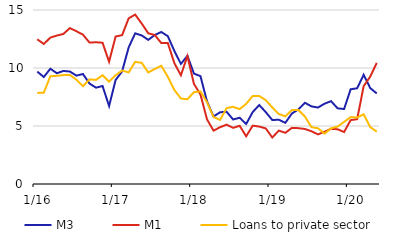
| Category | M3 | M1 | Loans to private sector |
|---|---|---|---|
|  1/16 | 9.691 | 12.477 | 7.853 |
| 2 | 9.221 | 12.071 | 7.865 |
| 3 | 9.937 | 12.619 | 9.286 |
| 4 | 9.548 | 12.796 | 9.325 |
| 5 | 9.747 | 12.937 | 9.385 |
| 6 | 9.696 | 13.442 | 9.403 |
| 7 | 9.341 | 13.169 | 8.992 |
| 8 | 9.484 | 12.872 | 8.426 |
| 9 | 8.659 | 12.193 | 9.022 |
| 10 | 8.307 | 12.218 | 8.975 |
| 11 | 8.449 | 12.177 | 9.38 |
| 12 | 6.723 | 10.54 | 8.816 |
|  1/17 | 8.966 | 12.711 | 9.379 |
| 2 | 9.714 | 12.834 | 9.781 |
| 3 | 11.775 | 14.282 | 9.62 |
| 4 | 12.987 | 14.606 | 10.528 |
| 5 | 12.808 | 13.83 | 10.445 |
| 6 | 12.425 | 12.993 | 9.619 |
| 7 | 12.849 | 12.842 | 9.914 |
| 8 | 13.105 | 12.147 | 10.193 |
| 9 | 12.743 | 12.148 | 9.238 |
| 10 | 11.473 | 10.419 | 8.113 |
| 11 | 10.355 | 9.377 | 7.368 |
| 12 | 11.047 | 11.032 | 7.305 |
|  1/18 | 9.516 | 8.626 | 7.918 |
| 2 | 9.298 | 7.714 | 7.983 |
| 3 | 7.121 | 5.573 | 7.051 |
| 4 | 5.819 | 4.602 | 5.78 |
| 5 | 6.185 | 4.894 | 5.522 |
| 6 | 6.228 | 5.118 | 6.536 |
| 7 | 5.561 | 4.84 | 6.657 |
| 8 | 5.712 | 5.02 | 6.454 |
| 9 | 5.172 | 4.113 | 6.908 |
| 10 | 6.2 | 5.031 | 7.59 |
| 11 | 6.807 | 4.95 | 7.588 |
| 12 | 6.195 | 4.794 | 7.229 |
|  1/19 | 5.516 | 4.009 | 6.6 |
| 2 | 5.54 | 4.604 | 6.035 |
| 3 | 5.275 | 4.413 | 5.835 |
| 4 | 6.075 | 4.839 | 6.369 |
| 5 | 6.427 | 4.813 | 6.374 |
| 6 | 7.002 | 4.742 | 5.815 |
| 7 | 6.692 | 4.549 | 4.899 |
| 8 | 6.591 | 4.278 | 4.808 |
| 9 | 6.924 | 4.5 | 4.343 |
| 10 | 7.14 | 4.758 | 4.797 |
| 11 | 6.526 | 4.72 | 4.948 |
| 12 | 6.463 | 4.481 | 5.357 |
|  1/20 | 8.164 | 5.503 | 5.765 |
| 2 | 8.253 | 5.59 | 5.73 |
| 3 | 9.419 | 8.44 | 6.009 |
| 4 | 8.269 | 9.253 | 4.908 |
| 5 | 7.805 | 10.442 | 4.515 |